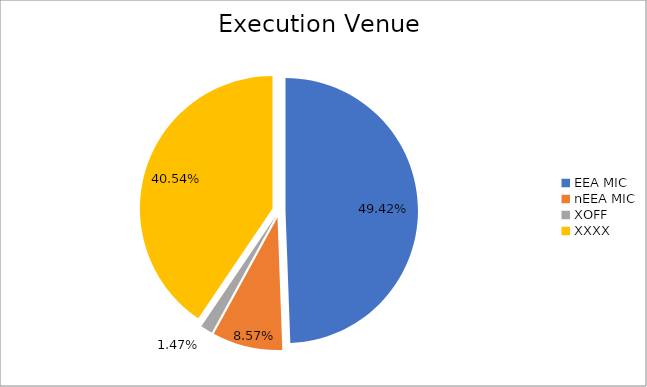
| Category | Series 0 |
|---|---|
| EEA MIC | 6701788.118 |
| nEEA MIC | 1161627.593 |
| XOFF | 199641.763 |
| XXXX | 5497854.496 |